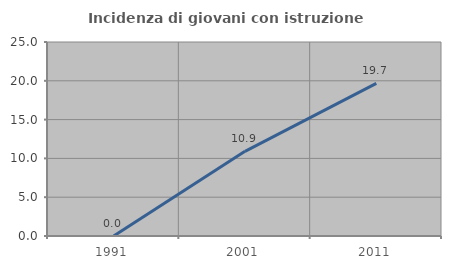
| Category | Incidenza di giovani con istruzione universitaria |
|---|---|
| 1991.0 | 0 |
| 2001.0 | 10.909 |
| 2011.0 | 19.672 |